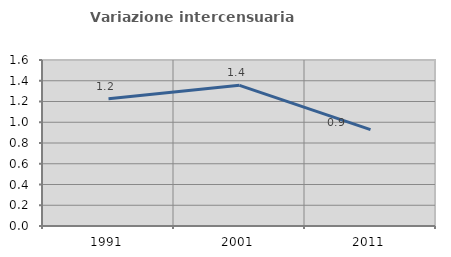
| Category | Variazione intercensuaria annua |
|---|---|
| 1991.0 | 1.227 |
| 2001.0 | 1.356 |
| 2011.0 | 0.929 |